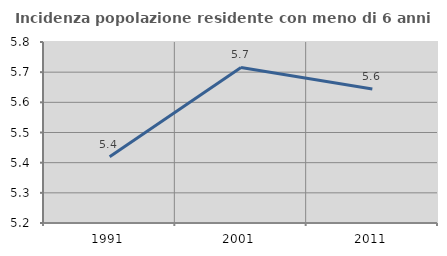
| Category | Incidenza popolazione residente con meno di 6 anni |
|---|---|
| 1991.0 | 5.42 |
| 2001.0 | 5.716 |
| 2011.0 | 5.644 |